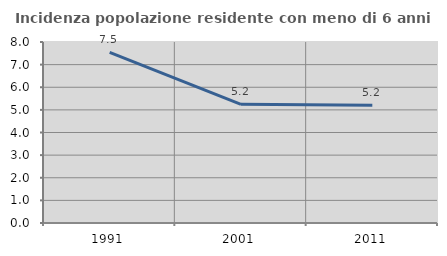
| Category | Incidenza popolazione residente con meno di 6 anni |
|---|---|
| 1991.0 | 7.539 |
| 2001.0 | 5.245 |
| 2011.0 | 5.204 |